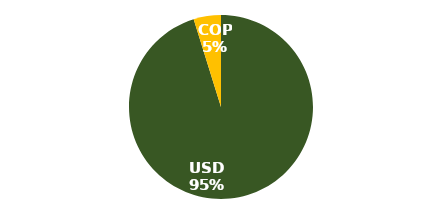
| Category | Series 0 |
|---|---|
| USD | 0.952 |
| COP | 0.048 |